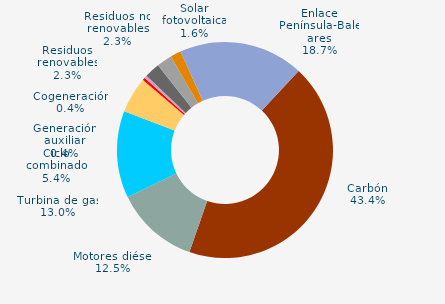
| Category | Series 0 |
|---|---|
| Carbón | 43.4 |
| Motores diésel | 12.5 |
| Turbina de gas | 13 |
| Ciclo combinado | 5.4 |
| Generación auxiliar | 0.4 |
| Cogeneración | 0.4 |
| Residuos no renovables | 2.3 |
| Residuos renovables | 2.3 |
| Eólica | 0 |
| Solar fotovoltaica | 1.6 |
| Otras renovables | 0 |
| Enlace Península-Baleares | 18.7 |